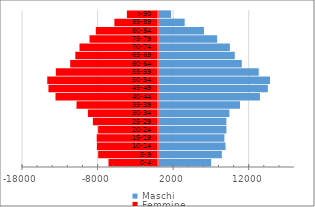
| Category | Maschi | Femmine |
|---|---|---|
| 0-4 | 6905 | -6556 |
| 5-9 | 8320 | -7914 |
| 10-14 | 8806 | -8091 |
| 15-19 | 8656 | -8114 |
| 20-24 | 8921 | -7922 |
| 25-29 | 8919 | -8621 |
| 30-34 | 9314 | -9275 |
| 35-39 | 10720 | -10783 |
| 40-44 | 13360 | -13567 |
| 45-49 | 14406 | -14498 |
| 50-54 | 14693 | -14660 |
| 55-59 | 13200 | -13523 |
| 60-64 | 10959 | -11620 |
| 65-69 | 10031 | -10943 |
| 70-74 | 9380 | -10389 |
| 75-79 | 7695 | -9065 |
| 80-84 | 5951 | -8231 |
| 85-89 | 3398 | -5772 |
| >90 | 1590 | -4118 |